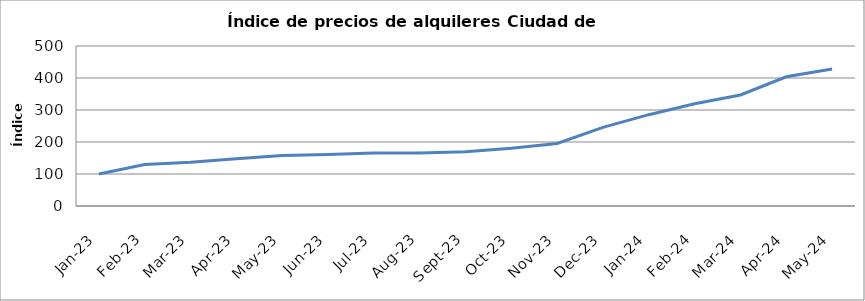
| Category | Series 0 |
|---|---|
| 2023-01-01 | 100 |
| 2023-02-01 | 129.688 |
| 2023-03-01 | 136.65 |
| 2023-04-01 | 147.749 |
| 2023-05-01 | 157.768 |
| 2023-06-01 | 161.21 |
| 2023-07-01 | 165.3 |
| 2023-08-01 | 165.456 |
| 2023-09-01 | 169.54 |
| 2023-10-01 | 180.792 |
| 2023-11-01 | 195.456 |
| 2023-12-01 | 245.583 |
| 2024-01-01 | 285.4 |
| 2024-02-01 | 319.506 |
| 2024-03-01 | 346.845 |
| 2024-04-01 | 403.789 |
| 2024-05-01 | 428.126 |